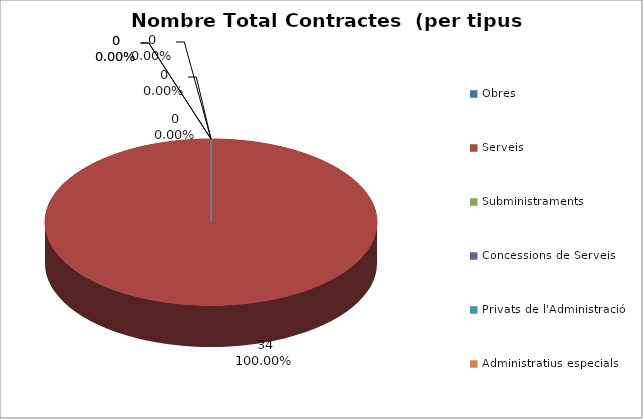
| Category | Nombre Total Contractes |
|---|---|
| Obres | 0 |
| Serveis | 34 |
| Subministraments | 0 |
| Concessions de Serveis | 0 |
| Privats de l'Administració | 0 |
| Administratius especials | 0 |